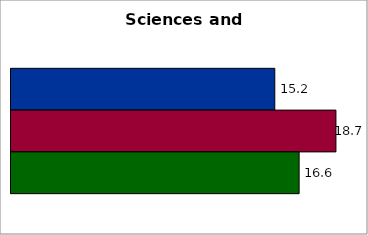
| Category | 50 states and D.C. | SREB states | State |
|---|---|---|---|
| 0 | 15.16 | 18.674 | 16.558 |